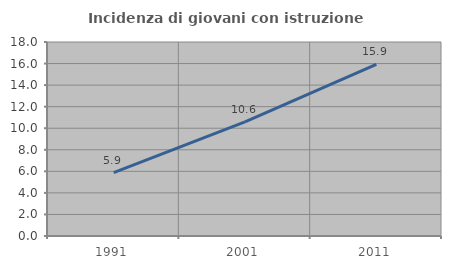
| Category | Incidenza di giovani con istruzione universitaria |
|---|---|
| 1991.0 | 5.875 |
| 2001.0 | 10.581 |
| 2011.0 | 15.92 |